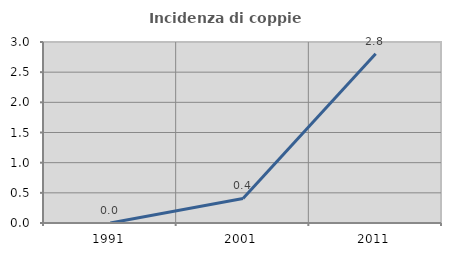
| Category | Incidenza di coppie miste |
|---|---|
| 1991.0 | 0 |
| 2001.0 | 0.406 |
| 2011.0 | 2.804 |